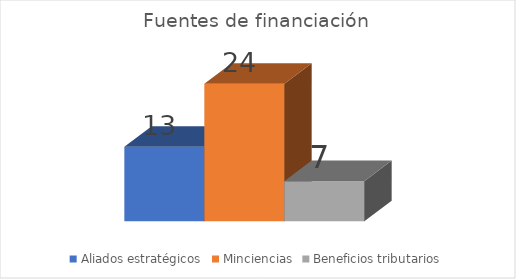
| Category | Aliados estratégicos | Minciencias | Beneficios tributarios |
|---|---|---|---|
| 0 | 13 | 24 | 7 |